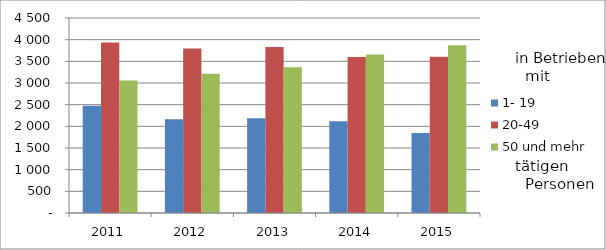
| Category | 1- 19 | 20-49 | 50 und mehr |
|---|---|---|---|
| 2011.0 | 2474 | 3933 | 3055 |
| 2012.0 | 2161 | 3794 | 3211 |
| 2013.0 | 2185 | 3829 | 3363 |
| 2014.0 | 2117 | 3601 | 3658 |
| 2015.0 | 1848 | 3603 | 3869 |